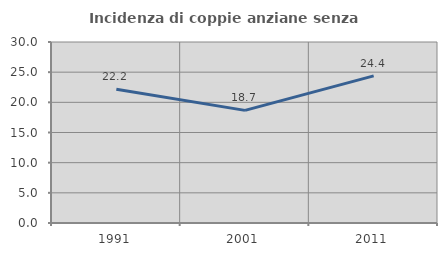
| Category | Incidenza di coppie anziane senza figli  |
|---|---|
| 1991.0 | 22.176 |
| 2001.0 | 18.667 |
| 2011.0 | 24.39 |